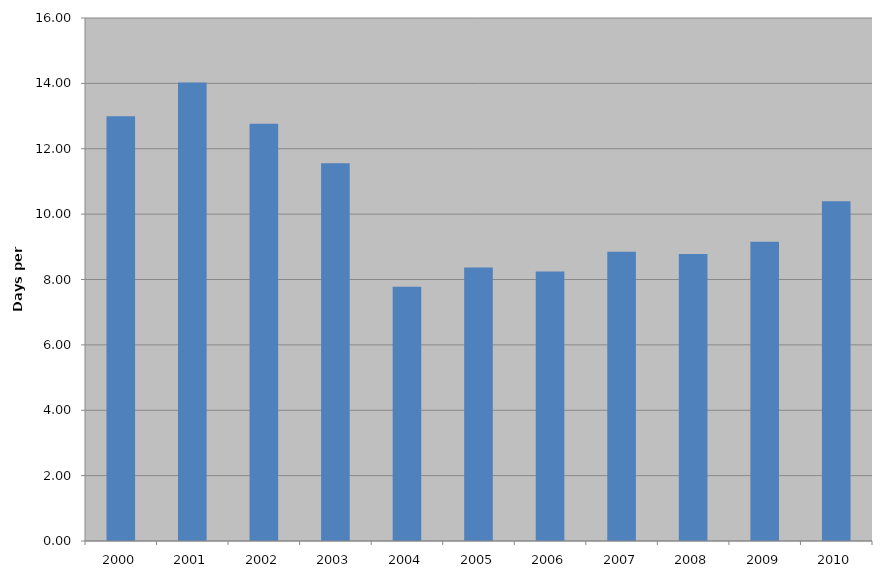
| Category | Total |
|---|---|
| 2000 | 12.992 |
| 2001 | 14.025 |
| 2002 | 12.762 |
| 2003 | 11.555 |
| 2004 | 7.776 |
| 2005 | 8.364 |
| 2006 | 8.246 |
| 2007 | 8.846 |
| 2008 | 8.779 |
| 2009 | 9.155 |
| 2010 | 10.395 |